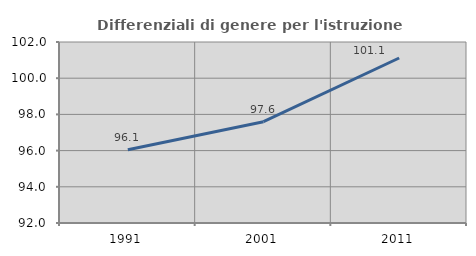
| Category | Differenziali di genere per l'istruzione superiore |
|---|---|
| 1991.0 | 96.051 |
| 2001.0 | 97.599 |
| 2011.0 | 101.116 |